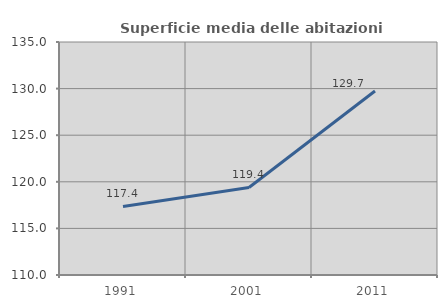
| Category | Superficie media delle abitazioni occupate |
|---|---|
| 1991.0 | 117.353 |
| 2001.0 | 119.394 |
| 2011.0 | 129.735 |